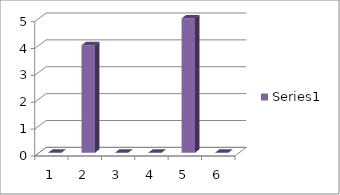
| Category | Series 0 |
|---|---|
| 0 | 0 |
| 1 | 4 |
| 2 | 0 |
| 3 | 0 |
| 4 | 5 |
| 5 | 0 |